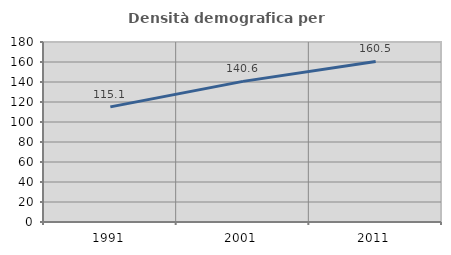
| Category | Densità demografica |
|---|---|
| 1991.0 | 115.113 |
| 2001.0 | 140.612 |
| 2011.0 | 160.506 |